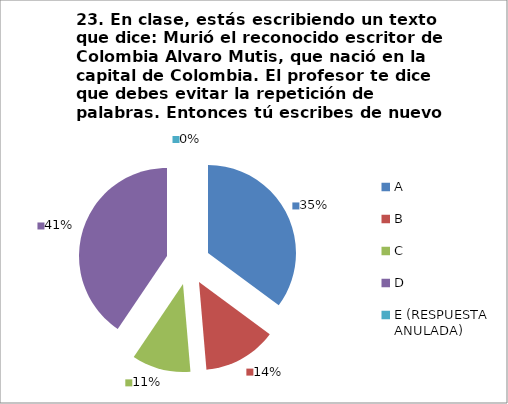
| Category | CANTIDAD DE RESPUESTAS PREGUNTA (23) | PORCENTAJE |
|---|---|---|
| A | 13 | 0.351 |
| B | 5 | 0.135 |
| C | 4 | 0.108 |
| D | 15 | 0.405 |
| E (RESPUESTA ANULADA) | 0 | 0 |